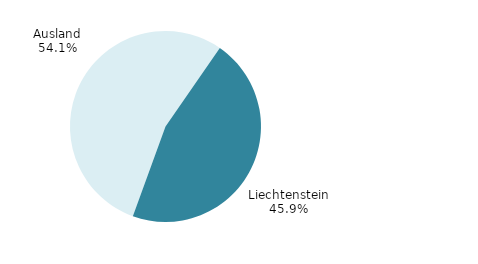
| Category | Series 0 |
|---|---|
| Ausland | 166 |
| Liechtenstein | 141 |